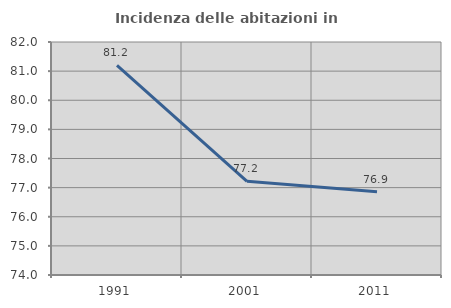
| Category | Incidenza delle abitazioni in proprietà  |
|---|---|
| 1991.0 | 81.194 |
| 2001.0 | 77.218 |
| 2011.0 | 76.861 |